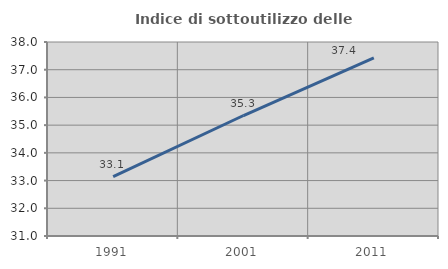
| Category | Indice di sottoutilizzo delle abitazioni  |
|---|---|
| 1991.0 | 33.143 |
| 2001.0 | 35.347 |
| 2011.0 | 37.425 |